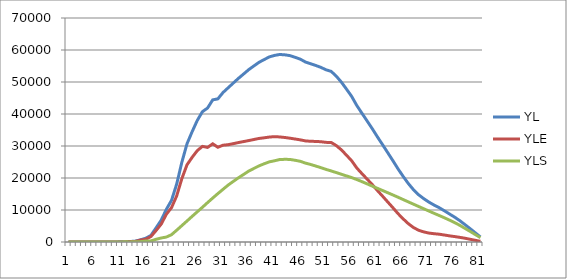
| Category | YL | YLE | YLS |
|---|---|---|---|
| 0 | 0 | 0 | 0 |
| 1 | 0 | 0 | 0 |
| 2 | 0 | 0 | 0 |
| 3 | 0 | 0 | 0 |
| 4 | 0 | 0 | 0 |
| 5 | 0 | 0 | 0 |
| 6 | 0 | 0 | 0 |
| 7 | 0 | 0 | 0 |
| 8 | 0 | 0 | 0 |
| 9 | 0 | 0 | 0 |
| 10 | 63.592 | 35.803 | 27.789 |
| 11 | 71.821 | 25.496 | 46.324 |
| 12 | 160.47 | 127.943 | 32.527 |
| 13 | 285.711 | 192.061 | 93.65 |
| 14 | 710.971 | 594.065 | 116.906 |
| 15 | 1175.473 | 866.077 | 309.395 |
| 16 | 2063.385 | 1720.21 | 343.175 |
| 17 | 4433.065 | 3589.779 | 843.286 |
| 18 | 6859.971 | 5600.885 | 1259.087 |
| 19 | 10227.122 | 8675.769 | 1551.353 |
| 20 | 13034.802 | 10749.868 | 2284.934 |
| 21 | 18095.634 | 14413.101 | 3682.533 |
| 22 | 24900.865 | 19784.549 | 5116.316 |
| 23 | 30675.502 | 24114.867 | 6560.636 |
| 24 | 34466.271 | 26455.999 | 8010.272 |
| 25 | 37993.184 | 28557.939 | 9435.245 |
| 26 | 40725.888 | 29881.098 | 10844.79 |
| 27 | 41869.154 | 29555.217 | 12313.937 |
| 28 | 44414.958 | 30680.098 | 13734.861 |
| 29 | 44732.202 | 29608.877 | 15123.325 |
| 30 | 46712.558 | 30248.977 | 16463.581 |
| 31 | 48196.488 | 30407.698 | 17788.79 |
| 32 | 49675.281 | 30731.014 | 18944.266 |
| 33 | 51145.908 | 31077.969 | 20067.94 |
| 34 | 52498.586 | 31387.303 | 21111.283 |
| 35 | 53867.052 | 31698.546 | 22168.506 |
| 36 | 55022.898 | 32031.972 | 22990.925 |
| 37 | 56160.224 | 32362.64 | 23797.584 |
| 38 | 57012.006 | 32561.914 | 24450.091 |
| 39 | 57844.688 | 32794.898 | 25049.79 |
| 40 | 58304.116 | 32922.432 | 25381.685 |
| 41 | 58598.474 | 32829.343 | 25769.131 |
| 42 | 58493.94 | 32659.528 | 25834.412 |
| 43 | 58243.933 | 32438.155 | 25805.778 |
| 44 | 57725.145 | 32183.972 | 25541.173 |
| 45 | 57139.646 | 31915.694 | 25223.953 |
| 46 | 56258.546 | 31596.206 | 24662.34 |
| 47 | 55713.57 | 31476.987 | 24236.583 |
| 48 | 55171.955 | 31426.666 | 23745.289 |
| 49 | 54576.636 | 31340.548 | 23236.088 |
| 50 | 53821.488 | 31134.358 | 22687.13 |
| 51 | 53328.383 | 31111.672 | 22216.71 |
| 52 | 51825.055 | 30132.641 | 21692.414 |
| 53 | 49938.727 | 28779.044 | 21159.683 |
| 54 | 47739.528 | 27095.675 | 20643.854 |
| 55 | 45471.793 | 25354.028 | 20117.765 |
| 56 | 42609.575 | 23096.442 | 19513.133 |
| 57 | 40190.144 | 21335.841 | 18854.303 |
| 58 | 37800.273 | 19634.617 | 18165.656 |
| 59 | 35380.969 | 17926.024 | 17454.945 |
| 60 | 32831.682 | 16066.371 | 16765.312 |
| 61 | 30391.139 | 14306.472 | 16084.667 |
| 62 | 27900.735 | 12502.842 | 15397.893 |
| 63 | 25403.126 | 10705.4 | 14697.726 |
| 64 | 22845.614 | 8855.352 | 13990.262 |
| 65 | 20474.756 | 7217.643 | 13257.112 |
| 66 | 18254.504 | 5721.195 | 12533.309 |
| 67 | 16333.378 | 4522.344 | 11811.034 |
| 68 | 14752.838 | 3657.3 | 11095.539 |
| 69 | 13532.028 | 3151.39 | 10380.639 |
| 70 | 12457.097 | 2786.511 | 9670.585 |
| 71 | 11543.035 | 2585.489 | 8957.546 |
| 72 | 10710.861 | 2436.797 | 8274.065 |
| 73 | 9748.715 | 2179.319 | 7569.396 |
| 74 | 8748.736 | 1915.488 | 6833.248 |
| 75 | 7753.07 | 1696.991 | 6056.079 |
| 76 | 6658.39 | 1453.684 | 5204.705 |
| 77 | 5425.894 | 1171.505 | 4254.39 |
| 78 | 4166.291 | 853.728 | 3312.563 |
| 79 | 2866.887 | 533.487 | 2333.4 |
| 80 | 1567.483 | 213.245 | 1354.238 |